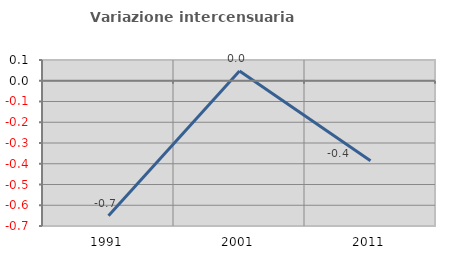
| Category | Variazione intercensuaria annua |
|---|---|
| 1991.0 | -0.65 |
| 2001.0 | 0.048 |
| 2011.0 | -0.386 |